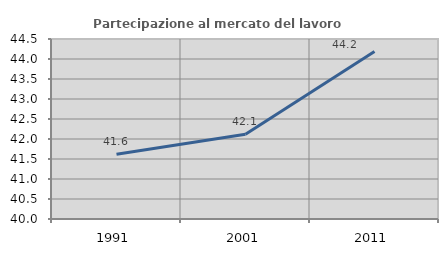
| Category | Partecipazione al mercato del lavoro  femminile |
|---|---|
| 1991.0 | 41.617 |
| 2001.0 | 42.117 |
| 2011.0 | 44.19 |